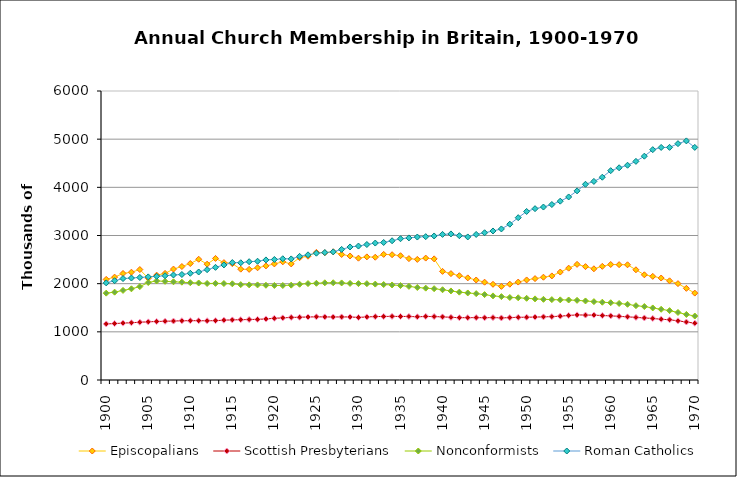
| Category | Episcopalians | Scottish Presbyterians | Nonconformists | Roman Catholics |
|---|---|---|---|---|
| 1900.0 | 2089 | 1164 | 1803 | 2016 |
| 1901.0 | 2136 | 1172 | 1824 | 2061 |
| 1902.0 | 2212 | 1181 | 1860 | 2106 |
| 1903.0 | 2238 | 1189 | 1893 | 2117 |
| 1904.0 | 2293 | 1199 | 1939 | 2129 |
| 1905.0 | 2113 | 1208 | 2024 | 2141 |
| 1906.0 | 2177 | 1215 | 2057 | 2153 |
| 1907.0 | 2213 | 1219 | 2048 | 2165 |
| 1908.0 | 2303 | 1224 | 2039 | 2180 |
| 1909.0 | 2356 | 1230 | 2031 | 2190 |
| 1910.0 | 2418 | 1232 | 2020 | 2216 |
| 1911.0 | 2507 | 1231 | 2014 | 2242 |
| 1912.0 | 2405 | 1230 | 2004 | 2291 |
| 1913.0 | 2524 | 1232 | 2006 | 2339 |
| 1914.0 | 2437 | 1242 | 2003 | 2389 |
| 1915.0 | 2416 | 1248 | 1997 | 2438 |
| 1916.0 | 2301 | 1252 | 1980 | 2434 |
| 1917.0 | 2297 | 1256 | 1975 | 2456 |
| 1918.0 | 2330 | 1259 | 1974 | 2466 |
| 1919.0 | 2369 | 1268 | 1967 | 2493 |
| 1920.0 | 2410 | 1281 | 1963 | 2502 |
| 1921.0 | 2453 | 1290 | 1962 | 2517 |
| 1922.0 | 2410 | 1299 | 1969 | 2514 |
| 1923.0 | 2540 | 1303 | 1988 | 2567 |
| 1924.0 | 2570 | 1308 | 2002 | 2599 |
| 1925.0 | 2650 | 1312 | 2008 | 2633 |
| 1926.0 | 2642 | 1310 | 2018 | 2646 |
| 1927.0 | 2662 | 1308 | 2019 | 2660 |
| 1928.0 | 2606 | 1310 | 2015 | 2711 |
| 1929.0 | 2575 | 1309 | 2005 | 2762 |
| 1930.0 | 2529 | 1299 | 2001 | 2781 |
| 1931.0 | 2556 | 1310 | 2000 | 2813 |
| 1932.0 | 2549 | 1317 | 1991 | 2843 |
| 1933.0 | 2608 | 1319 | 1982 | 2855 |
| 1934.0 | 2601 | 1321 | 1973 | 2891 |
| 1935.0 | 2580 | 1319 | 1961 | 2933 |
| 1936.0 | 2520 | 1320 | 1944 | 2950 |
| 1937.0 | 2504 | 1312 | 1921 | 2968 |
| 1938.0 | 2531 | 1319 | 1907 | 2976 |
| 1939.0 | 2515 | 1317 | 1896 | 2990 |
| 1940.0 | 2255 | 1311 | 1874 | 3023 |
| 1941.0 | 2209 | 1301 | 1849 | 3033 |
| 1942.0 | 2165 | 1294 | 1824 | 2996 |
| 1943.0 | 2120 | 1294 | 1807 | 2970 |
| 1944.0 | 2076 | 1296 | 1793 | 3022 |
| 1945.0 | 2031 | 1292 | 1773 | 3057 |
| 1946.0 | 1987 | 1297 | 1746 | 3094 |
| 1947.0 | 1944 | 1289 | 1731 | 3136 |
| 1948.0 | 1989 | 1296 | 1713 | 3235 |
| 1949.0 | 2033 | 1301 | 1707 | 3370 |
| 1950.0 | 2077 | 1304 | 1696 | 3499 |
| 1951.0 | 2105 | 1306 | 1684 | 3557 |
| 1952.0 | 2134 | 1311 | 1675 | 3591 |
| 1953.0 | 2161 | 1316 | 1669 | 3643 |
| 1954.0 | 2241 | 1325 | 1664 | 3713 |
| 1955.0 | 2322 | 1340 | 1661 | 3800 |
| 1956.0 | 2401 | 1352 | 1654 | 3927 |
| 1957.0 | 2354 | 1348 | 1641 | 4064 |
| 1958.0 | 2309 | 1347 | 1627 | 4123 |
| 1959.0 | 2360 | 1338 | 1615 | 4210 |
| 1960.0 | 2398 | 1332 | 1604 | 4346 |
| 1961.0 | 2395 | 1321 | 1589 | 4406 |
| 1962.0 | 2392 | 1312 | 1572 | 4459 |
| 1963.0 | 2288 | 1299 | 1543 | 4539 |
| 1964.0 | 2184 | 1289 | 1525 | 4647 |
| 1965.0 | 2152 | 1277 | 1496 | 4782 |
| 1966.0 | 2117 | 1262 | 1468 | 4828 |
| 1967.0 | 2059 | 1250 | 1440 | 4830 |
| 1968.0 | 2001 | 1229 | 1402 | 4907 |
| 1969.0 | 1903 | 1204 | 1361 | 4964 |
| 1970.0 | 1804 | 1179 | 1328 | 4829 |